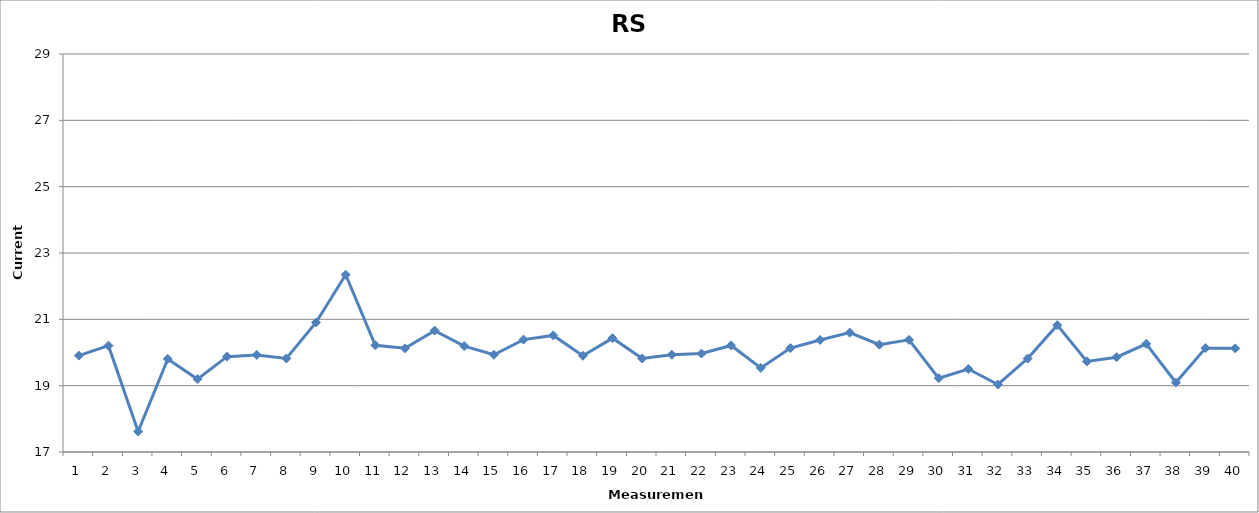
| Category | Series 0 |
|---|---|
| 0 | 19.908 |
| 1 | 20.206 |
| 2 | 17.618 |
| 3 | 19.807 |
| 4 | 19.198 |
| 5 | 19.875 |
| 6 | 19.927 |
| 7 | 19.82 |
| 8 | 20.905 |
| 9 | 22.346 |
| 10 | 20.218 |
| 11 | 20.126 |
| 12 | 20.66 |
| 13 | 20.194 |
| 14 | 19.933 |
| 15 | 20.388 |
| 16 | 20.515 |
| 17 | 19.902 |
| 18 | 20.433 |
| 19 | 19.819 |
| 20 | 19.932 |
| 21 | 19.969 |
| 22 | 20.213 |
| 23 | 19.536 |
| 24 | 20.132 |
| 25 | 20.379 |
| 26 | 20.598 |
| 27 | 20.237 |
| 28 | 20.381 |
| 29 | 19.226 |
| 30 | 19.503 |
| 31 | 19.035 |
| 32 | 19.818 |
| 33 | 20.824 |
| 34 | 19.731 |
| 35 | 19.859 |
| 36 | 20.261 |
| 37 | 19.095 |
| 38 | 20.132 |
| 39 | 20.125 |